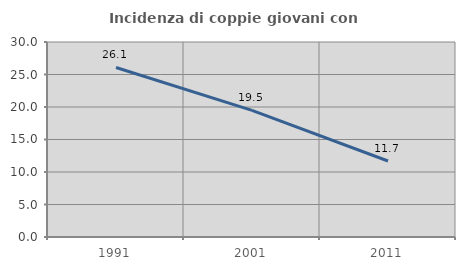
| Category | Incidenza di coppie giovani con figli |
|---|---|
| 1991.0 | 26.079 |
| 2001.0 | 19.48 |
| 2011.0 | 11.695 |